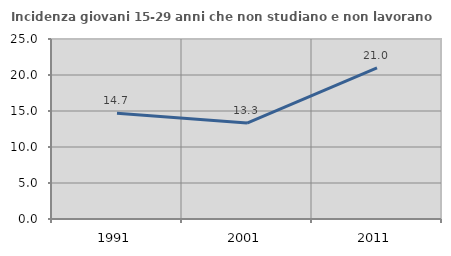
| Category | Incidenza giovani 15-29 anni che non studiano e non lavorano  |
|---|---|
| 1991.0 | 14.682 |
| 2001.0 | 13.323 |
| 2011.0 | 20.976 |